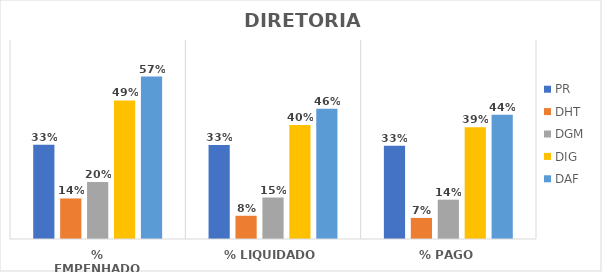
| Category | PR | DHT | DGM | DIG | DAF |
|---|---|---|---|---|---|
| % EMPENHADO | 0.332 | 0.143 | 0.201 | 0.487 | 0.572 |
| % LIQUIDADO | 0.331 | 0.082 | 0.146 | 0.401 | 0.458 |
| % PAGO | 0.328 | 0.074 | 0.138 | 0.393 | 0.437 |